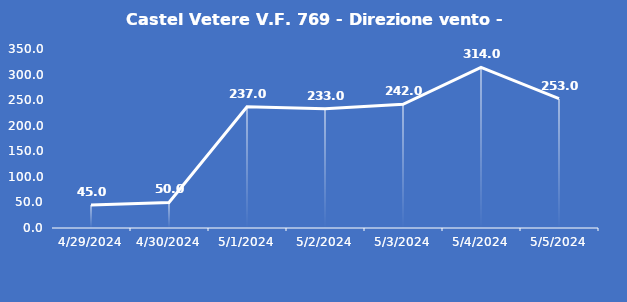
| Category | Castel Vetere V.F. 769 - Direzione vento - Grezzo (°N) |
|---|---|
| 4/29/24 | 45 |
| 4/30/24 | 50 |
| 5/1/24 | 237 |
| 5/2/24 | 233 |
| 5/3/24 | 242 |
| 5/4/24 | 314 |
| 5/5/24 | 253 |